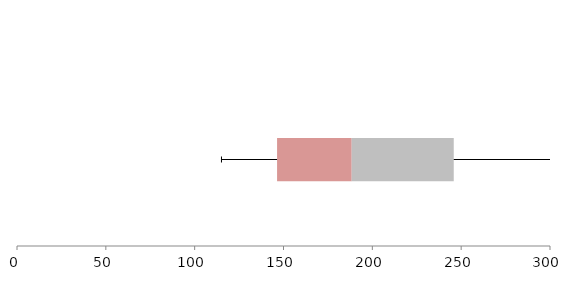
| Category | Series 1 | Series 2 | Series 3 |
|---|---|---|---|
| 0 | 146.383 | 42.005 | 57.436 |